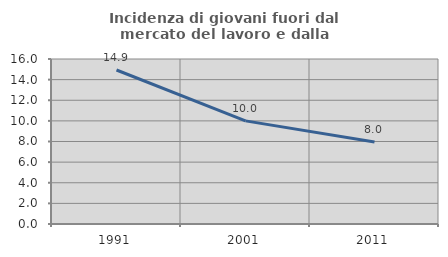
| Category | Incidenza di giovani fuori dal mercato del lavoro e dalla formazione  |
|---|---|
| 1991.0 | 14.935 |
| 2001.0 | 10 |
| 2011.0 | 7.955 |